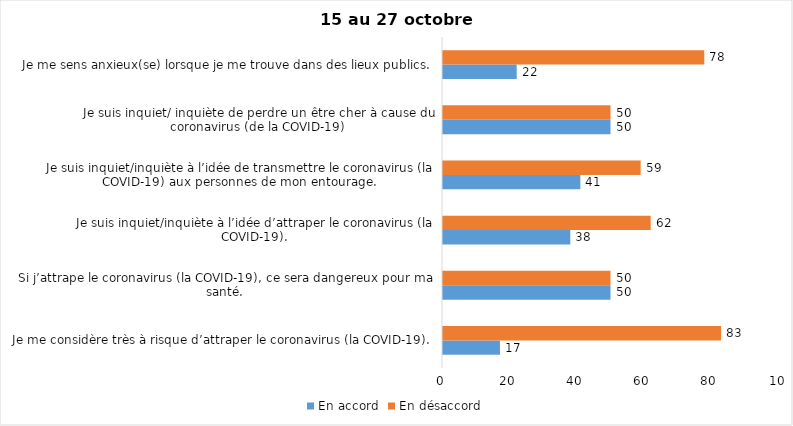
| Category | En accord | En désaccord |
|---|---|---|
| Je me considère très à risque d’attraper le coronavirus (la COVID-19). | 17 | 83 |
| Si j’attrape le coronavirus (la COVID-19), ce sera dangereux pour ma santé. | 50 | 50 |
| Je suis inquiet/inquiète à l’idée d’attraper le coronavirus (la COVID-19). | 38 | 62 |
| Je suis inquiet/inquiète à l’idée de transmettre le coronavirus (la COVID-19) aux personnes de mon entourage. | 41 | 59 |
| Je suis inquiet/ inquiète de perdre un être cher à cause du coronavirus (de la COVID-19) | 50 | 50 |
| Je me sens anxieux(se) lorsque je me trouve dans des lieux publics. | 22 | 78 |